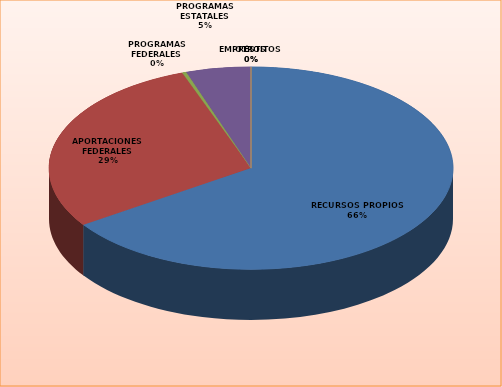
| Category | Series 0 |
|---|---|
| RECURSOS PROPIOS | 39462243 |
| APORTACIONES FEDERALES | 17416028 |
| PROGRAMAS FEDERALES | 200000 |
| PROGRAMAS ESTATALES | 3122000 |
| EMPRÉSTITOS | 0 |
| OTROS | 0 |